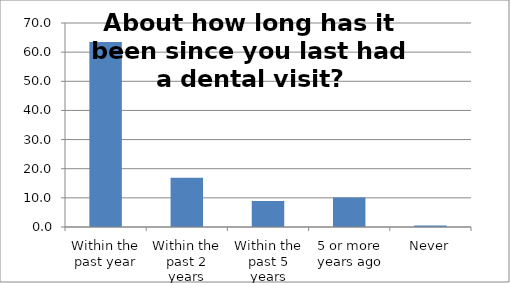
| Category | Series 0 |
|---|---|
| Within the past year | 63.513 |
| Within the past 2 years | 16.871 |
| Within the past 5 years | 8.925 |
| 5 or more years ago | 10.165 |
| Never | 0.526 |